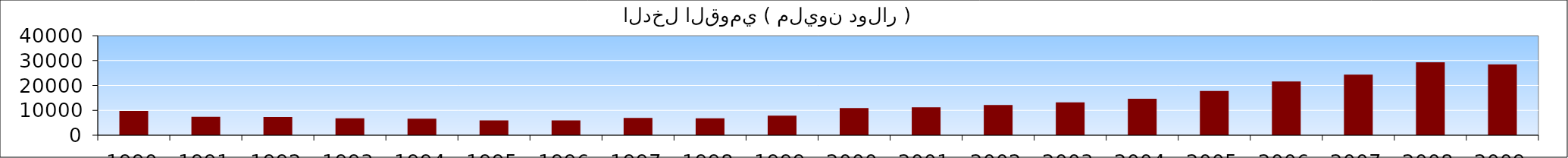
| Category | الدخل القومي ( مليون دولار ) |
|---|---|
| 1990.0 | 9787.787 |
| 1991.0 | 7371.022 |
| 1992.0 | 7324.421 |
| 1993.0 | 6778.503 |
| 1994.0 | 6678.096 |
| 1995.0 | 5940.37 |
| 1996.0 | 5968.242 |
| 1997.0 | 6979.324 |
| 1998.0 | 6788.21 |
| 1999.0 | 7849.117 |
| 2000.0 | 10911.303 |
| 2001.0 | 11239.118 |
| 2002.0 | 12143.713 |
| 2003.0 | 13199.723 |
| 2004.0 | 14653.626 |
| 2005.0 | 17753.293 |
| 2006.0 | 21579.409 |
| 2007.0 | 24315.75 |
| 2008.0 | 29285.874 |
| 2009.0 | 28497.336 |